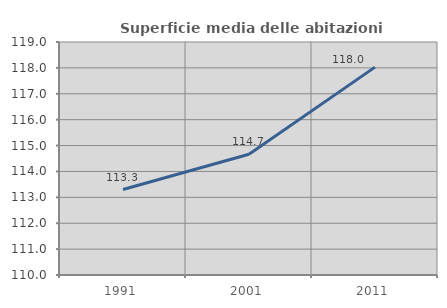
| Category | Superficie media delle abitazioni occupate |
|---|---|
| 1991.0 | 113.302 |
| 2001.0 | 114.665 |
| 2011.0 | 118.03 |